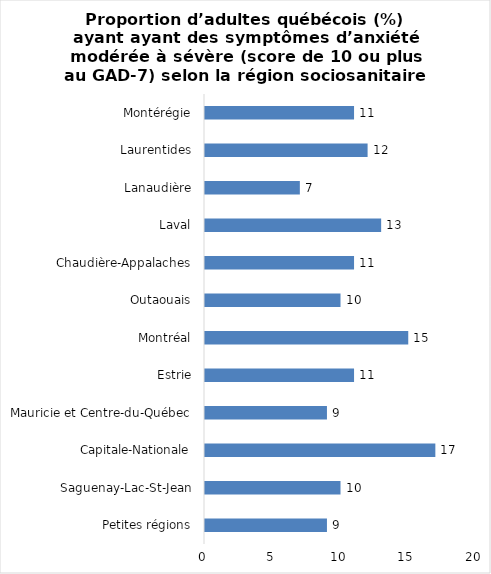
| Category | Series 0 |
|---|---|
| Petites régions | 9 |
| Saguenay-Lac-St-Jean | 10 |
| Capitale-Nationale | 17 |
| Mauricie et Centre-du-Québec | 9 |
| Estrie | 11 |
| Montréal | 15 |
| Outaouais | 10 |
| Chaudière-Appalaches | 11 |
| Laval | 13 |
| Lanaudière | 7 |
| Laurentides | 12 |
| Montérégie | 11 |